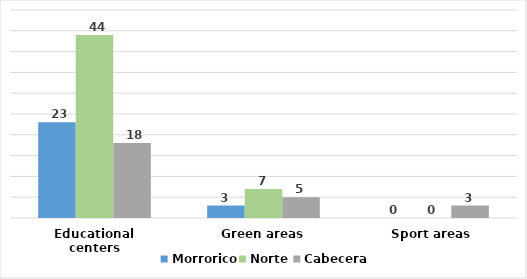
| Category | Morrorico | Norte | Cabecera |
|---|---|---|---|
| Educational centers | 23 | 44 | 18 |
| Green areas | 3 | 7 | 5 |
| Sport areas | 0 | 0 | 3 |